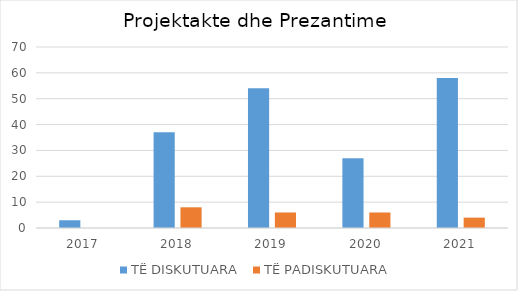
| Category | TË DISKUTUARA  | TË PADISKUTUARA  |
|---|---|---|
| 2017.0 | 3 | 0 |
| 2018.0 | 37 | 8 |
| 2019.0 | 54 | 6 |
| 2020.0 | 27 | 6 |
| 2021.0 | 58 | 4 |